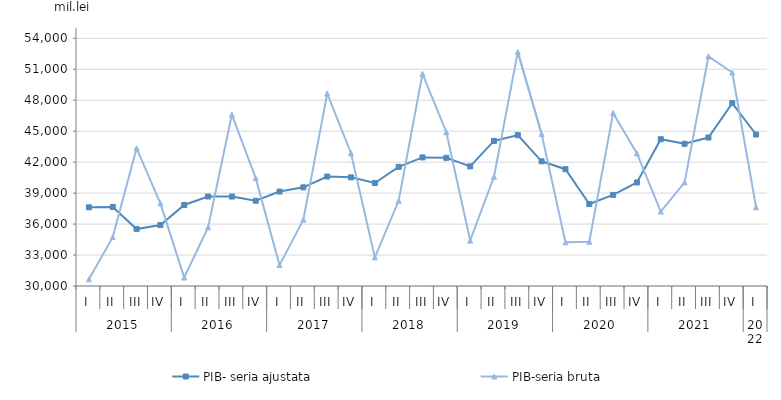
| Category | PIB- seria ajustata | PIB-seria bruta |
|---|---|---|
| 0 | 37625.463 | 30646.968 |
| 1 | 37659.864 | 34735.688 |
| 2 | 35513.648 | 43346.775 |
| 3 | 35907.947 | 38010.774 |
| 4 | 37851.482 | 30820.063 |
| 5 | 38672.912 | 35681.038 |
| 6 | 38665.204 | 46605.396 |
| 7 | 38260.944 | 40451.279 |
| 8 | 39150.881 | 32024.184 |
| 9 | 39560.156 | 36428.585 |
| 10 | 40609.557 | 48653.891 |
| 11 | 40529.676 | 42863.094 |
| 12 | 39976.568 | 32776.193 |
| 13 | 41545.391 | 38256.673 |
| 14 | 42460.682 | 50555.085 |
| 15 | 42419.398 | 44901.521 |
| 16 | 41592.587 | 34400.981 |
| 17 | 44059.402 | 40586.704 |
| 18 | 44617.023 | 52682.383 |
| 19 | 42080.975 | 44733.633 |
| 20 | 41320.099 | 34239.338 |
| 21 | 37943.835 | 34284.718 |
| 22 | 38827.007 | 46760.714 |
| 23 | 40033.57 | 42850.839 |
| 24 | 44227.183 | 37214.944 |
| 25 | 43782.822 | 40039.024 |
| 26 | 44387.203 | 52242.905 |
| 27 | 47723.891 | 50690.098 |
| 28 | 44678.404 | 37627.837 |